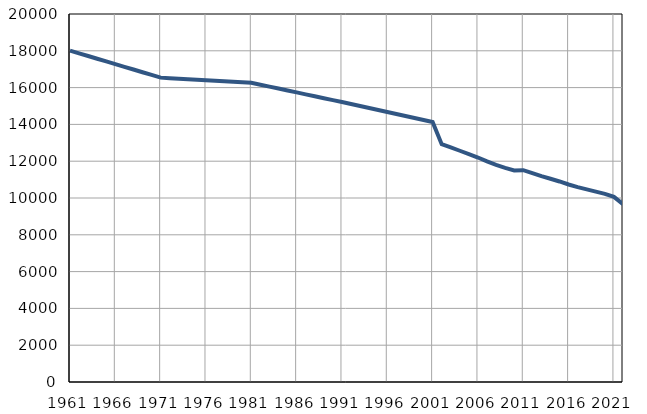
| Category | Број
становника |
|---|---|
| 1961.0 | 18010 |
| 1962.0 | 17863 |
| 1963.0 | 17716 |
| 1964.0 | 17570 |
| 1965.0 | 17423 |
| 1966.0 | 17276 |
| 1967.0 | 17129 |
| 1968.0 | 16982 |
| 1969.0 | 16836 |
| 1970.0 | 16689 |
| 1971.0 | 16542 |
| 1972.0 | 16514 |
| 1973.0 | 16486 |
| 1974.0 | 16458 |
| 1975.0 | 16430 |
| 1976.0 | 16402 |
| 1977.0 | 16374 |
| 1978.0 | 16346 |
| 1979.0 | 16318 |
| 1980.0 | 16290 |
| 1981.0 | 16262 |
| 1982.0 | 16157 |
| 1983.0 | 16053 |
| 1984.0 | 15948 |
| 1985.0 | 15844 |
| 1986.0 | 15739 |
| 1987.0 | 15634 |
| 1988.0 | 15530 |
| 1989.0 | 15425 |
| 1990.0 | 15321 |
| 1991.0 | 15216 |
| 1992.0 | 15107 |
| 1993.0 | 14998 |
| 1994.0 | 14890 |
| 1995.0 | 14781 |
| 1996.0 | 14672 |
| 1997.0 | 14563 |
| 1998.0 | 14454 |
| 1999.0 | 14345 |
| 2000.0 | 14237 |
| 2001.0 | 14128 |
| 2002.0 | 12927 |
| 2003.0 | 12755 |
| 2004.0 | 12568 |
| 2005.0 | 12389 |
| 2006.0 | 12200 |
| 2007.0 | 11986 |
| 2008.0 | 11795 |
| 2009.0 | 11636 |
| 2010.0 | 11498 |
| 2011.0 | 11512 |
| 2012.0 | 11352 |
| 2013.0 | 11188 |
| 2014.0 | 11045 |
| 2015.0 | 10899 |
| 2016.0 | 10735 |
| 2017.0 | 10591 |
| 2018.0 | 10467 |
| 2019.0 | 10344 |
| 2020.0 | 10226 |
| 2021.0 | 10062 |
| 2022.0 | 9668 |